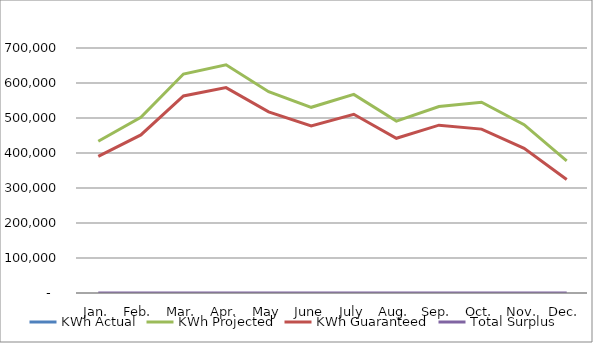
| Category | KWh Actual | KWh Projected | KWh Guaranteed | Total Surplus |
|---|---|---|---|---|
| Jan. |  | 433721.578 | 390363.076 | 0 |
| Feb. |  | 501740.175 | 451581.955 | 0 |
| Mar. |  | 625534.403 | 563000.659 | 0 |
| Apr. |  | 652106.448 | 586916.335 | 0 |
| May |  | 575022.864 | 517538.683 | 0 |
| June |  | 530565.383 | 477525.551 | 0 |
| July |  | 567403.968 | 510681.437 | 0 |
| Aug. |  | 491199.914 | 442095.388 | 0 |
| Sep. |  | 532751.124 | 479492.786 | 0 |
| Oct. |  | 544866.477 | 468218.227 | 0 |
| Nov. |  | 481019.927 | 413353.192 | 0 |
| Dec. |  | 377256.768 | 324186.755 | 0 |